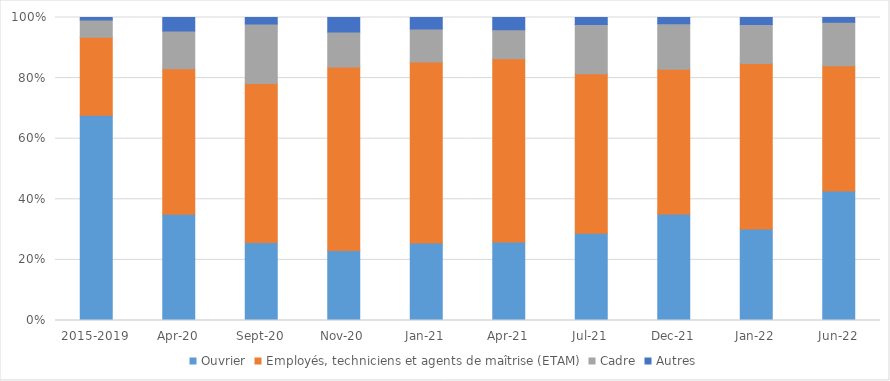
| Category | Ouvrier | Employés, techniciens et agents de maîtrise (ETAM) | Cadre | Autres |
|---|---|---|---|---|
| 2015-2019 | 0.678 | 0.257 | 0.057 | 0.008 |
| avr-20 | 0.35 | 0.48 | 0.125 | 0.044 |
| sept-20 | 0.257 | 0.525 | 0.197 | 0.021 |
| nov-20 | 0.231 | 0.606 | 0.115 | 0.048 |
| janv-21 | 0.256 | 0.597 | 0.109 | 0.038 |
| avr-21 | 0.259 | 0.605 | 0.096 | 0.04 |
| juil-21 | 0.288 | 0.526 | 0.163 | 0.023 |
| déc-21 | 0.351 | 0.477 | 0.15 | 0.021 |
| janv-22 | 0.302 | 0.547 | 0.129 | 0.023 |
| juin-22 | 0.427 | 0.414 | 0.144 | 0.015 |